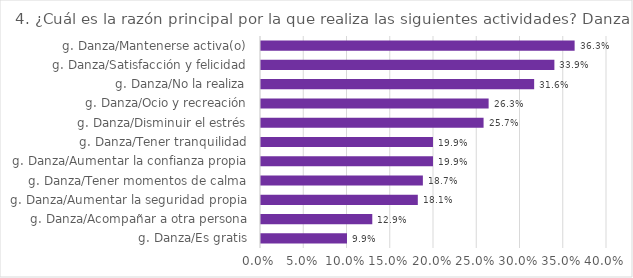
| Category | Series 0 |
|---|---|
| g. Danza/Es gratis | 0.099 |
| g. Danza/Acompañar a otra persona | 0.129 |
| g. Danza/Aumentar la seguridad propia | 0.181 |
| g. Danza/Tener momentos de calma | 0.187 |
| g. Danza/Aumentar la confianza propia | 0.199 |
| g. Danza/Tener tranquilidad | 0.199 |
| g. Danza/Disminuir el estrés | 0.257 |
| g. Danza/Ocio y recreación | 0.263 |
| g. Danza/No la realiza | 0.316 |
| g. Danza/Satisfacción y felicidad | 0.339 |
| g. Danza/Mantenerse activa(o) | 0.363 |